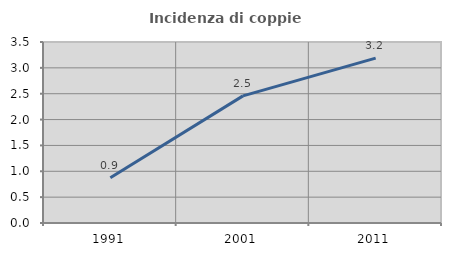
| Category | Incidenza di coppie miste |
|---|---|
| 1991.0 | 0.874 |
| 2001.0 | 2.458 |
| 2011.0 | 3.188 |